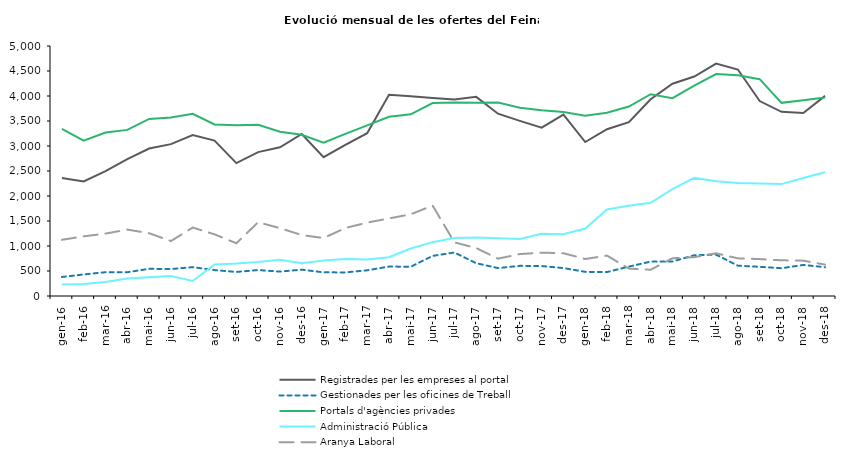
| Category | Registrades per les empreses al portal | Gestionades per les oficines de Treball | Portals d'agències privades | Administració Pública | Aranya Laboral |
|---|---|---|---|---|---|
| gen-16 | 2358 | 380 | 3344 | 232 | 1124 |
| feb-16 | 2291 | 431 | 3106 | 240 | 1193 |
| mar-16 | 2496 | 476 | 3268 | 282 | 1248 |
| abr-16 | 2738 | 476 | 3322 | 349 | 1328 |
| mai-16 | 2949 | 544 | 3542 | 373 | 1256 |
| jun-16 | 3037 | 539 | 3570 | 399 | 1099 |
| jul-16 | 3217 | 577 | 3643 | 300 | 1369 |
| ago-16 | 3109 | 518 | 3431 | 632 | 1233 |
| set-16 | 2658 | 481 | 3414 | 650 | 1055 |
| oct-16 | 2878 | 519 | 3426 | 680 | 1475 |
| nov-16 | 2973 | 488 | 3285 | 726 | 1357 |
| des-16 | 3241 | 527 | 3225 | 656 | 1219 |
| gen-17 | 2776 | 473 | 3065 | 709 | 1159 |
| feb-17 | 3021 | 472 | 3243 | 738 | 1360 |
| mar-17 | 3257 | 514 | 3412 | 729 | 1468 |
| abr-17 | 4024 | 589 | 3584 | 775 | 1551 |
| mai-17 | 3995 | 585 | 3634 | 950 | 1635 |
| jun-17 | 3958 | 802 | 3860 | 1077 | 1809 |
| jul-17 | 3929 | 870 | 3870 | 1159 | 1073 |
| ago-17 | 3983 | 656 | 3866 | 1171 | 959 |
| set-17 | 3646 | 558 | 3869 | 1157 | 747 |
| oct-17 | 3502 | 603 | 3766 | 1141 | 838 |
| nov-17 | 3367 | 599 | 3713 | 1246 | 867 |
| des-17 | 3627 | 559 | 3680 | 1237 | 856 |
| gen-18 | 3080 | 483 | 3605 | 1350 | 740 |
| feb-18 | 3336 | 479 | 3664 | 1729 | 808 |
| mar-18 | 3476 | 588 | 3789 | 1807 | 548 |
| abr-18 | 3934 | 688 | 4036 | 1864 | 525 |
| mai-18 | 4245 | 690 | 3956 | 2138 | 755 |
| jun-18 | 4390 | 815 | 4206 | 2362 | 777 |
| jul-18 | 4648 | 827 | 4440 | 2296 | 854 |
| ago-18 | 4530 | 606 | 4416 | 2262 | 753 |
| set-18 | 3899 | 584 | 4337 | 2251 | 738 |
| oct-18 | 3683 | 556 | 3863 | 2238 | 714 |
| nov-18 | 3661 | 621 | 3916 | 2359 | 707 |
| des-18 | 4003 | 576 | 3972 | 2474 | 627 |